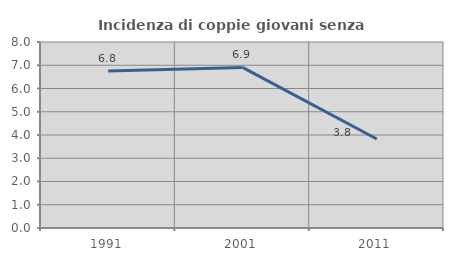
| Category | Incidenza di coppie giovani senza figli |
|---|---|
| 1991.0 | 6.754 |
| 2001.0 | 6.906 |
| 2011.0 | 3.827 |